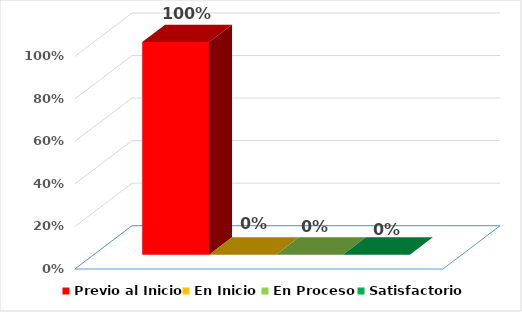
| Category | Previo al Inicio | En Inicio | En Proceso | Satisfactorio |
|---|---|---|---|---|
| 0 | 1 | 0 | 0 | 0 |